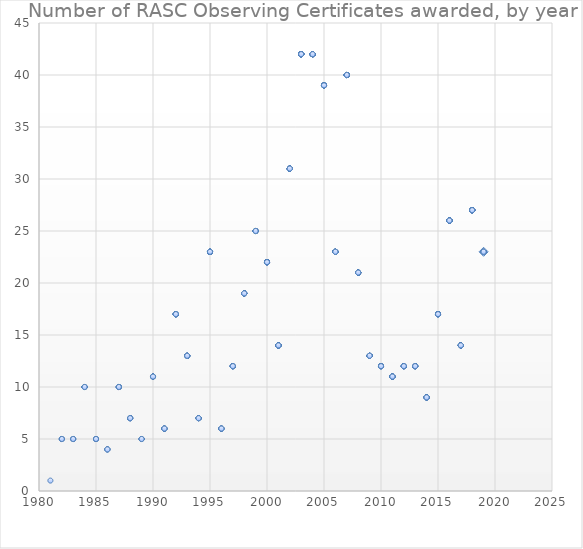
| Category | Series 0 |
|---|---|
| 2019.0 | 23 |
| 2019.0 | 23 |
| 2019.0 | 23 |
| 2019.0 | 23 |
| 2019.0 | 23 |
| 2019.0 | 23 |
| 2019.0 | 23 |
| 2019.0 | 23 |
| 2019.0 | 23 |
| 2018.0 | 27 |
| 2018.0 | 27 |
| 2018.0 | 27 |
| 2018.0 | 27 |
| 2018.0 | 27 |
| 2018.0 | 27 |
| 2018.0 | 27 |
| 2018.0 | 27 |
| 2018.0 | 27 |
| 2018.0 | 27 |
| 2018.0 | 27 |
| 2018.0 | 27 |
| 2018.0 | 27 |
| 2018.0 | 27 |
| 2018.0 | 27 |
| 2018.0 | 27 |
| 2018.0 | 27 |
| 2018.0 | 27 |
| 2018.0 | 27 |
| 2018.0 | 27 |
| 2018.0 | 27 |
| 2018.0 | 27 |
| 2018.0 | 27 |
| 2018.0 | 27 |
| 2018.0 | 27 |
| 2018.0 | 27 |
| 2018.0 | 27 |
| 2017.0 | 14 |
| 2017.0 | 14 |
| 2017.0 | 14 |
| 2017.0 | 14 |
| 2017.0 | 14 |
| 2017.0 | 14 |
| 2017.0 | 14 |
| 2017.0 | 14 |
| 2017.0 | 14 |
| 2017.0 | 14 |
| 2017.0 | 14 |
| 2017.0 | 14 |
| 2017.0 | 14 |
| 2017.0 | 14 |
| 2016.0 | 26 |
| 2016.0 | 26 |
| 2016.0 | 26 |
| 2016.0 | 26 |
| 2016.0 | 26 |
| 2016.0 | 26 |
| 2016.0 | 26 |
| 2016.0 | 26 |
| 2016.0 | 26 |
| 2016.0 | 26 |
| 2016.0 | 26 |
| 2016.0 | 26 |
| 2016.0 | 26 |
| 2016.0 | 26 |
| 2016.0 | 26 |
| 2016.0 | 26 |
| 2016.0 | 26 |
| 2016.0 | 26 |
| 2016.0 | 26 |
| 2016.0 | 26 |
| 2016.0 | 26 |
| 2016.0 | 26 |
| 2016.0 | 26 |
| 2016.0 | 26 |
| 2016.0 | 26 |
| 2016.0 | 26 |
| 2015.0 | 17 |
| 2015.0 | 17 |
| 2015.0 | 17 |
| 2015.0 | 17 |
| 2015.0 | 17 |
| 2015.0 | 17 |
| 2015.0 | 17 |
| 2015.0 | 17 |
| 2015.0 | 17 |
| 2015.0 | 17 |
| 2015.0 | 17 |
| 2015.0 | 17 |
| 2015.0 | 17 |
| 2015.0 | 17 |
| 2015.0 | 17 |
| 2015.0 | 17 |
| 2015.0 | 17 |
| 2014.0 | 9 |
| 2014.0 | 9 |
| 2014.0 | 9 |
| 2014.0 | 9 |
| 2014.0 | 9 |
| 2014.0 | 9 |
| 2014.0 | 9 |
| 2014.0 | 9 |
| 2014.0 | 9 |
| 2013.0 | 12 |
| 2013.0 | 12 |
| 2013.0 | 12 |
| 2013.0 | 12 |
| 2013.0 | 12 |
| 2013.0 | 12 |
| 2013.0 | 12 |
| 2013.0 | 12 |
| 2013.0 | 12 |
| 2013.0 | 12 |
| 2013.0 | 12 |
| 2013.0 | 12 |
| 2012.0 | 12 |
| 2012.0 | 12 |
| 2012.0 | 12 |
| 2012.0 | 12 |
| 2012.0 | 12 |
| 2012.0 | 12 |
| 2012.0 | 12 |
| 2012.0 | 12 |
| 2012.0 | 12 |
| 2012.0 | 12 |
| 2012.0 | 12 |
| 2012.0 | 12 |
| 2011.0 | 11 |
| 2011.0 | 11 |
| 2011.0 | 11 |
| 2011.0 | 11 |
| 2011.0 | 11 |
| 2011.0 | 11 |
| 2011.0 | 11 |
| 2011.0 | 11 |
| 2011.0 | 11 |
| 2011.0 | 11 |
| 2011.0 | 11 |
| 2010.0 | 12 |
| 2010.0 | 12 |
| 2010.0 | 12 |
| 2010.0 | 12 |
| 2010.0 | 12 |
| 2010.0 | 12 |
| 2010.0 | 12 |
| 2010.0 | 12 |
| 2010.0 | 12 |
| 2010.0 | 12 |
| 2010.0 | 12 |
| 2010.0 | 12 |
| 2009.0 | 13 |
| 2009.0 | 13 |
| 2009.0 | 13 |
| 2009.0 | 13 |
| 2009.0 | 13 |
| 2009.0 | 13 |
| 2009.0 | 13 |
| 2009.0 | 13 |
| 2009.0 | 13 |
| 2009.0 | 13 |
| 2009.0 | 13 |
| 2009.0 | 13 |
| 2009.0 | 13 |
| 2008.0 | 21 |
| 2008.0 | 21 |
| 2008.0 | 21 |
| 2008.0 | 21 |
| 2008.0 | 21 |
| 2008.0 | 21 |
| 2008.0 | 21 |
| 2008.0 | 21 |
| 2008.0 | 21 |
| 2008.0 | 21 |
| 2008.0 | 21 |
| 2008.0 | 21 |
| 2008.0 | 21 |
| 2008.0 | 21 |
| 2008.0 | 21 |
| 2008.0 | 21 |
| 2008.0 | 21 |
| 2008.0 | 21 |
| 2008.0 | 21 |
| 2008.0 | 21 |
| 2008.0 | 21 |
| 2007.0 | 40 |
| 2007.0 | 40 |
| 2007.0 | 40 |
| 2007.0 | 40 |
| 2007.0 | 40 |
| 2007.0 | 40 |
| 2007.0 | 40 |
| 2007.0 | 40 |
| 2007.0 | 40 |
| 2007.0 | 40 |
| 2007.0 | 40 |
| 2007.0 | 40 |
| 2007.0 | 40 |
| 2007.0 | 40 |
| 2007.0 | 40 |
| 2007.0 | 40 |
| 2007.0 | 40 |
| 2007.0 | 40 |
| 2007.0 | 40 |
| 2007.0 | 40 |
| 2007.0 | 40 |
| 2007.0 | 40 |
| 2007.0 | 40 |
| 2007.0 | 40 |
| 2007.0 | 40 |
| 2007.0 | 40 |
| 2007.0 | 40 |
| 2007.0 | 40 |
| 2007.0 | 40 |
| 2007.0 | 40 |
| 2007.0 | 40 |
| 2007.0 | 40 |
| 2007.0 | 40 |
| 2007.0 | 40 |
| 2007.0 | 40 |
| 2007.0 | 40 |
| 2007.0 | 40 |
| 2007.0 | 40 |
| 2007.0 | 40 |
| 2007.0 | 40 |
| 2006.0 | 23 |
| 2006.0 | 23 |
| 2006.0 | 23 |
| 2006.0 | 23 |
| 2006.0 | 23 |
| 2006.0 | 23 |
| 2006.0 | 23 |
| 2006.0 | 23 |
| 2006.0 | 23 |
| 2006.0 | 23 |
| 2006.0 | 23 |
| 2006.0 | 23 |
| 2006.0 | 23 |
| 2006.0 | 23 |
| 2006.0 | 23 |
| 2006.0 | 23 |
| 2006.0 | 23 |
| 2006.0 | 23 |
| 2006.0 | 23 |
| 2006.0 | 23 |
| 2006.0 | 23 |
| 2006.0 | 23 |
| 2006.0 | 23 |
| 2005.0 | 39 |
| 2005.0 | 39 |
| 2005.0 | 39 |
| 2005.0 | 39 |
| 2005.0 | 39 |
| 2005.0 | 39 |
| 2005.0 | 39 |
| 2005.0 | 39 |
| 2005.0 | 39 |
| 2005.0 | 39 |
| 2005.0 | 39 |
| 2005.0 | 39 |
| 2005.0 | 39 |
| 2005.0 | 39 |
| 2005.0 | 39 |
| 2005.0 | 39 |
| 2005.0 | 39 |
| 2005.0 | 39 |
| 2005.0 | 39 |
| 2005.0 | 39 |
| 2005.0 | 39 |
| 2005.0 | 39 |
| 2005.0 | 39 |
| 2005.0 | 39 |
| 2005.0 | 39 |
| 2005.0 | 39 |
| 2005.0 | 39 |
| 2005.0 | 39 |
| 2005.0 | 39 |
| 2005.0 | 39 |
| 2005.0 | 39 |
| 2005.0 | 39 |
| 2005.0 | 39 |
| 2005.0 | 39 |
| 2005.0 | 39 |
| 2005.0 | 39 |
| 2005.0 | 39 |
| 2005.0 | 39 |
| 2005.0 | 39 |
| 2004.0 | 42 |
| 2004.0 | 42 |
| 2004.0 | 42 |
| 2004.0 | 42 |
| 2004.0 | 42 |
| 2004.0 | 42 |
| 2004.0 | 42 |
| 2004.0 | 42 |
| 2004.0 | 42 |
| 2004.0 | 42 |
| 2004.0 | 42 |
| 2004.0 | 42 |
| 2004.0 | 42 |
| 2004.0 | 42 |
| 2004.0 | 42 |
| 2004.0 | 42 |
| 2004.0 | 42 |
| 2004.0 | 42 |
| 2004.0 | 42 |
| 2004.0 | 42 |
| 2004.0 | 42 |
| 2004.0 | 42 |
| 2004.0 | 42 |
| 2004.0 | 42 |
| 2004.0 | 42 |
| 2004.0 | 42 |
| 2004.0 | 42 |
| 2004.0 | 42 |
| 2004.0 | 42 |
| 2004.0 | 42 |
| 2004.0 | 42 |
| 2004.0 | 42 |
| 2004.0 | 42 |
| 2004.0 | 42 |
| 2004.0 | 42 |
| 2004.0 | 42 |
| 2004.0 | 42 |
| 2004.0 | 42 |
| 2004.0 | 42 |
| 2004.0 | 42 |
| 2004.0 | 42 |
| 2004.0 | 42 |
| 2003.0 | 42 |
| 2003.0 | 42 |
| 2003.0 | 42 |
| 2003.0 | 42 |
| 2003.0 | 42 |
| 2003.0 | 42 |
| 2003.0 | 42 |
| 2003.0 | 42 |
| 2003.0 | 42 |
| 2003.0 | 42 |
| 2003.0 | 42 |
| 2003.0 | 42 |
| 2003.0 | 42 |
| 2003.0 | 42 |
| 2003.0 | 42 |
| 2003.0 | 42 |
| 2003.0 | 42 |
| 2003.0 | 42 |
| 2003.0 | 42 |
| 2003.0 | 42 |
| 2003.0 | 42 |
| 2003.0 | 42 |
| 2003.0 | 42 |
| 2003.0 | 42 |
| 2003.0 | 42 |
| 2003.0 | 42 |
| 2003.0 | 42 |
| 2003.0 | 42 |
| 2003.0 | 42 |
| 2003.0 | 42 |
| 2003.0 | 42 |
| 2003.0 | 42 |
| 2003.0 | 42 |
| 2003.0 | 42 |
| 2003.0 | 42 |
| 2003.0 | 42 |
| 2003.0 | 42 |
| 2003.0 | 42 |
| 2003.0 | 42 |
| 2003.0 | 42 |
| 2003.0 | 42 |
| 2003.0 | 42 |
| 2002.0 | 31 |
| 2002.0 | 31 |
| 2002.0 | 31 |
| 2002.0 | 31 |
| 2002.0 | 31 |
| 2002.0 | 31 |
| 2002.0 | 31 |
| 2002.0 | 31 |
| 2002.0 | 31 |
| 2002.0 | 31 |
| 2002.0 | 31 |
| 2002.0 | 31 |
| 2002.0 | 31 |
| 2002.0 | 31 |
| 2002.0 | 31 |
| 2002.0 | 31 |
| 2002.0 | 31 |
| 2002.0 | 31 |
| 2002.0 | 31 |
| 2002.0 | 31 |
| 2002.0 | 31 |
| 2002.0 | 31 |
| 2002.0 | 31 |
| 2002.0 | 31 |
| 2002.0 | 31 |
| 2002.0 | 31 |
| 2002.0 | 31 |
| 2002.0 | 31 |
| 2002.0 | 31 |
| 2002.0 | 31 |
| 2002.0 | 31 |
| 2001.0 | 14 |
| 2001.0 | 14 |
| 2001.0 | 14 |
| 2001.0 | 14 |
| 2001.0 | 14 |
| 2001.0 | 14 |
| 2001.0 | 14 |
| 2001.0 | 14 |
| 2001.0 | 14 |
| 2001.0 | 14 |
| 2001.0 | 14 |
| 2001.0 | 14 |
| 2001.0 | 14 |
| 2001.0 | 14 |
| 2000.0 | 22 |
| 2000.0 | 22 |
| 2000.0 | 22 |
| 2000.0 | 22 |
| 2000.0 | 22 |
| 2000.0 | 22 |
| 2000.0 | 22 |
| 2000.0 | 22 |
| 2000.0 | 22 |
| 2000.0 | 22 |
| 2000.0 | 22 |
| 2000.0 | 22 |
| 2000.0 | 22 |
| 2000.0 | 22 |
| 2000.0 | 22 |
| 2000.0 | 22 |
| 2000.0 | 22 |
| 2000.0 | 22 |
| 2000.0 | 22 |
| 2000.0 | 22 |
| 2000.0 | 22 |
| 2000.0 | 22 |
| 1999.0 | 25 |
| 1999.0 | 25 |
| 1999.0 | 25 |
| 1999.0 | 25 |
| 1999.0 | 25 |
| 1999.0 | 25 |
| 1999.0 | 25 |
| 1999.0 | 25 |
| 1999.0 | 25 |
| 1999.0 | 25 |
| 1999.0 | 25 |
| 1999.0 | 25 |
| 1999.0 | 25 |
| 1999.0 | 25 |
| 1999.0 | 25 |
| 1999.0 | 25 |
| 1999.0 | 25 |
| 1999.0 | 25 |
| 1999.0 | 25 |
| 1999.0 | 25 |
| 1999.0 | 25 |
| 1999.0 | 25 |
| 1999.0 | 25 |
| 1999.0 | 25 |
| 1999.0 | 25 |
| 1998.0 | 19 |
| 1998.0 | 19 |
| 1998.0 | 19 |
| 1998.0 | 19 |
| 1998.0 | 19 |
| 1998.0 | 19 |
| 1998.0 | 19 |
| 1998.0 | 19 |
| 1998.0 | 19 |
| 1998.0 | 19 |
| 1998.0 | 19 |
| 1998.0 | 19 |
| 1998.0 | 19 |
| 1998.0 | 19 |
| 1998.0 | 19 |
| 1998.0 | 19 |
| 1998.0 | 19 |
| 1998.0 | 19 |
| 1998.0 | 19 |
| 1997.0 | 12 |
| 1997.0 | 12 |
| 1997.0 | 12 |
| 1997.0 | 12 |
| 1997.0 | 12 |
| 1997.0 | 12 |
| 1997.0 | 12 |
| 1997.0 | 12 |
| 1997.0 | 12 |
| 1997.0 | 12 |
| 1997.0 | 12 |
| 1997.0 | 12 |
| 1996.0 | 6 |
| 1996.0 | 6 |
| 1996.0 | 6 |
| 1996.0 | 6 |
| 1996.0 | 6 |
| 1996.0 | 6 |
| 1995.0 | 23 |
| 1995.0 | 23 |
| 1995.0 | 23 |
| 1995.0 | 23 |
| 1995.0 | 23 |
| 1995.0 | 23 |
| 1995.0 | 23 |
| 1995.0 | 23 |
| 1995.0 | 23 |
| 1995.0 | 23 |
| 1995.0 | 23 |
| 1995.0 | 23 |
| 1995.0 | 23 |
| 1995.0 | 23 |
| 1995.0 | 23 |
| 1995.0 | 23 |
| 1995.0 | 23 |
| 1995.0 | 23 |
| 1995.0 | 23 |
| 1995.0 | 23 |
| 1995.0 | 23 |
| 1995.0 | 23 |
| 1995.0 | 23 |
| 1994.0 | 7 |
| 1994.0 | 7 |
| 1994.0 | 7 |
| 1994.0 | 7 |
| 1994.0 | 7 |
| 1994.0 | 7 |
| 1994.0 | 7 |
| 1993.0 | 13 |
| 1993.0 | 13 |
| 1993.0 | 13 |
| 1993.0 | 13 |
| 1993.0 | 13 |
| 1993.0 | 13 |
| 1993.0 | 13 |
| 1993.0 | 13 |
| 1993.0 | 13 |
| 1993.0 | 13 |
| 1993.0 | 13 |
| 1993.0 | 13 |
| 1993.0 | 13 |
| 1992.0 | 17 |
| 1992.0 | 17 |
| 1992.0 | 17 |
| 1992.0 | 17 |
| 1992.0 | 17 |
| 1992.0 | 17 |
| 1992.0 | 17 |
| 1992.0 | 17 |
| 1992.0 | 17 |
| 1992.0 | 17 |
| 1992.0 | 17 |
| 1992.0 | 17 |
| 1992.0 | 17 |
| 1992.0 | 17 |
| 1992.0 | 17 |
| 1992.0 | 17 |
| 1992.0 | 17 |
| 1991.0 | 6 |
| 1991.0 | 6 |
| 1991.0 | 6 |
| 1991.0 | 6 |
| 1991.0 | 6 |
| 1991.0 | 6 |
| 1990.0 | 11 |
| 1990.0 | 11 |
| 1990.0 | 11 |
| 1990.0 | 11 |
| 1990.0 | 11 |
| 1990.0 | 11 |
| 1990.0 | 11 |
| 1990.0 | 11 |
| 1990.0 | 11 |
| 1990.0 | 11 |
| 1990.0 | 11 |
| 1989.0 | 5 |
| 1989.0 | 5 |
| 1989.0 | 5 |
| 1989.0 | 5 |
| 1989.0 | 5 |
| 1988.0 | 7 |
| 1988.0 | 7 |
| 1988.0 | 7 |
| 1988.0 | 7 |
| 1988.0 | 7 |
| 1988.0 | 7 |
| 1988.0 | 7 |
| 1987.0 | 10 |
| 1987.0 | 10 |
| 1987.0 | 10 |
| 1987.0 | 10 |
| 1987.0 | 10 |
| 1987.0 | 10 |
| 1987.0 | 10 |
| 1987.0 | 10 |
| 1987.0 | 10 |
| 1987.0 | 10 |
| 1986.0 | 4 |
| 1986.0 | 4 |
| 1986.0 | 4 |
| 1986.0 | 4 |
| 1985.0 | 5 |
| 1985.0 | 5 |
| 1985.0 | 5 |
| 1985.0 | 5 |
| 1985.0 | 5 |
| 1984.0 | 10 |
| 1984.0 | 10 |
| 1984.0 | 10 |
| 1984.0 | 10 |
| 1984.0 | 10 |
| 1984.0 | 10 |
| 1984.0 | 10 |
| 1984.0 | 10 |
| 1984.0 | 10 |
| 1984.0 | 10 |
| 1983.0 | 5 |
| 1983.0 | 5 |
| 1983.0 | 5 |
| 1983.0 | 5 |
| 1983.0 | 5 |
| 1982.0 | 5 |
| 1982.0 | 5 |
| 1982.0 | 5 |
| 1982.0 | 5 |
| 1982.0 | 5 |
| 1981.0 | 1 |